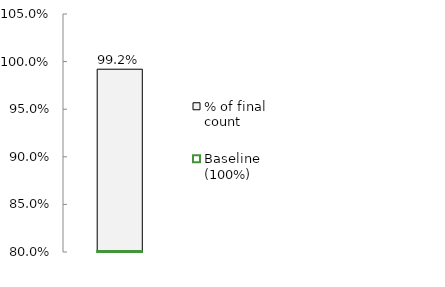
| Category | % of final count |
|---|---|
| 0 | 0.992 |